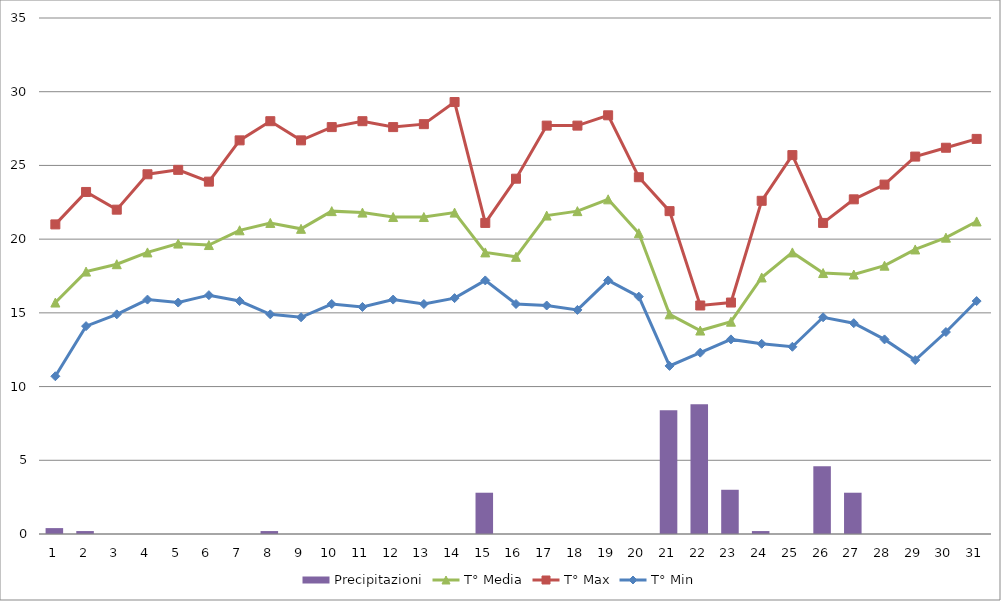
| Category | Precipitazioni |
|---|---|
| 0 | 0.4 |
| 1 | 0.2 |
| 2 | 0 |
| 3 | 0 |
| 4 | 0 |
| 5 | 0 |
| 6 | 0 |
| 7 | 0.2 |
| 8 | 0 |
| 9 | 0 |
| 10 | 0 |
| 11 | 0 |
| 12 | 0 |
| 13 | 0 |
| 14 | 2.8 |
| 15 | 0 |
| 16 | 0 |
| 17 | 0 |
| 18 | 0 |
| 19 | 0 |
| 20 | 8.4 |
| 21 | 8.8 |
| 22 | 3 |
| 23 | 0.2 |
| 24 | 0 |
| 25 | 4.6 |
| 26 | 2.8 |
| 27 | 0 |
| 28 | 0 |
| 29 | 0 |
| 30 | 0 |